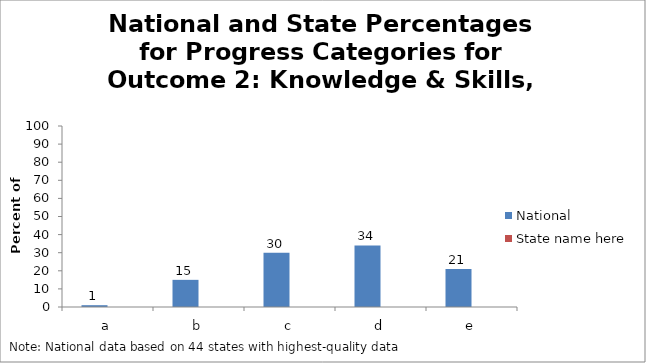
| Category | National | State name here |
|---|---|---|
| a | 1 |  |
| b | 15 |  |
| c | 30 |  |
| d | 34 |  |
| e | 21 |  |